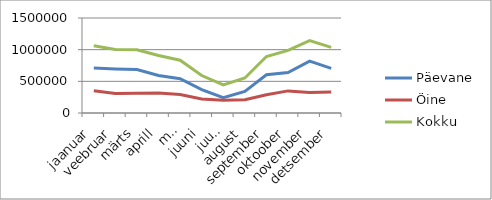
| Category | Päevane | Öine | Kokku |
|---|---|---|---|
| jaanuar | 711262.7 | 350531.7 | 1061794.4 |
| veebruar | 695280.5 | 307611.3 | 1002891.8 |
| märts | 685580.2 | 311757.6 | 997337.8 |
| aprill | 592794 | 315302.6 | 908096.6 |
| mai | 542319.5 | 290938.4 | 833257.9 |
| juuni | 368398 | 222822.3 | 591220.3 |
| juuli | 241553.361 | 201822.343 | 443375.704 |
| august | 341252.408 | 211038.598 | 552291.006 |
| september | 602838.23 | 288670.691 | 891508.921 |
| oktoober | 640028.049 | 349045.945 | 989073.994 |
| november | 817946.828 | 325294.123 | 1143240.951 |
| detsember | 703893.198 | 332721.013 | 1036614.211 |